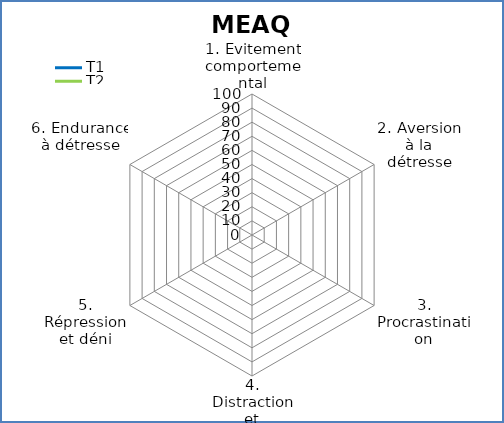
| Category | T1 | T2 |
|---|---|---|
| 1. Evitement comportemental | 0 | 0 |
| 2. Aversion à la détresse | 0 | 0 |
| 3. Procrastination | 0 | 0 |
| 4. Distraction et suppression | 0 | 0 |
| 5. Répression et déni | 0 | 0 |
| 6. Endurance à détresse | 0 | 0 |